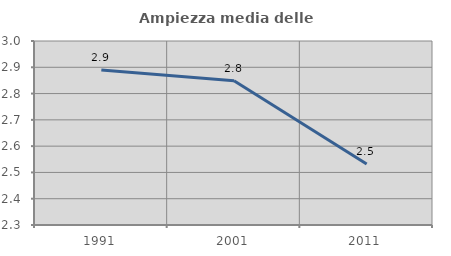
| Category | Ampiezza media delle famiglie |
|---|---|
| 1991.0 | 2.89 |
| 2001.0 | 2.849 |
| 2011.0 | 2.532 |